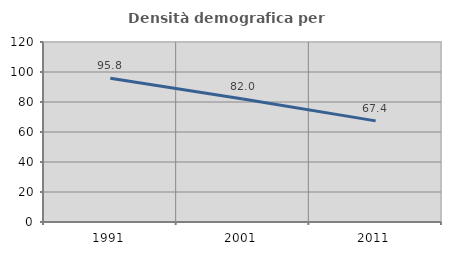
| Category | Densità demografica |
|---|---|
| 1991.0 | 95.8 |
| 2001.0 | 81.984 |
| 2011.0 | 67.417 |